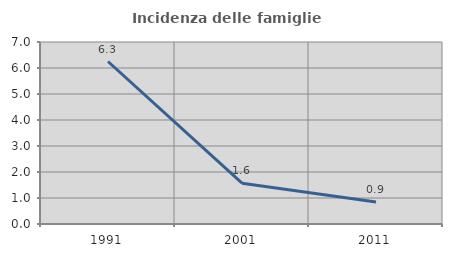
| Category | Incidenza delle famiglie numerose |
|---|---|
| 1991.0 | 6.25 |
| 2001.0 | 1.568 |
| 2011.0 | 0.85 |